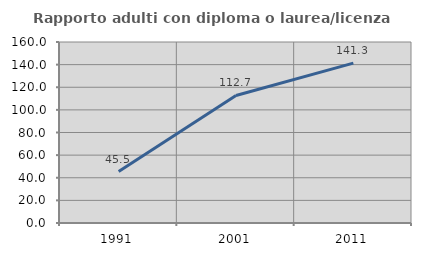
| Category | Rapporto adulti con diploma o laurea/licenza media  |
|---|---|
| 1991.0 | 45.503 |
| 2001.0 | 112.745 |
| 2011.0 | 141.328 |